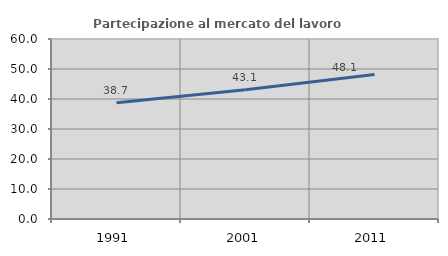
| Category | Partecipazione al mercato del lavoro  femminile |
|---|---|
| 1991.0 | 38.738 |
| 2001.0 | 43.095 |
| 2011.0 | 48.13 |